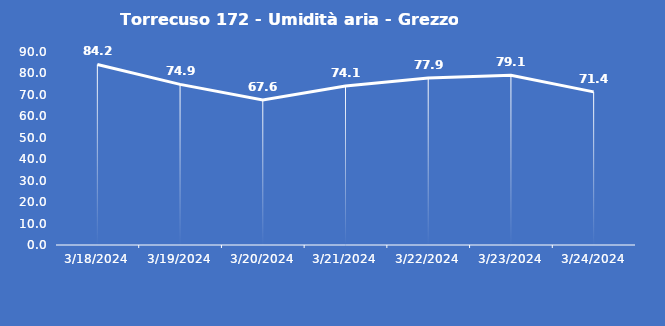
| Category | Torrecuso 172 - Umidità aria - Grezzo (%) |
|---|---|
| 3/18/24 | 84.2 |
| 3/19/24 | 74.9 |
| 3/20/24 | 67.6 |
| 3/21/24 | 74.1 |
| 3/22/24 | 77.9 |
| 3/23/24 | 79.1 |
| 3/24/24 | 71.4 |